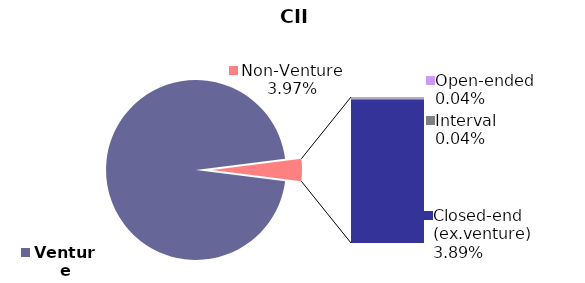
| Category | 31.03.2018 |
|---|---|
| Venture | 0.96 |
| Open-ended | 0 |
| Interval | 0 |
| Closed-end (ex.venture) | 0.039 |